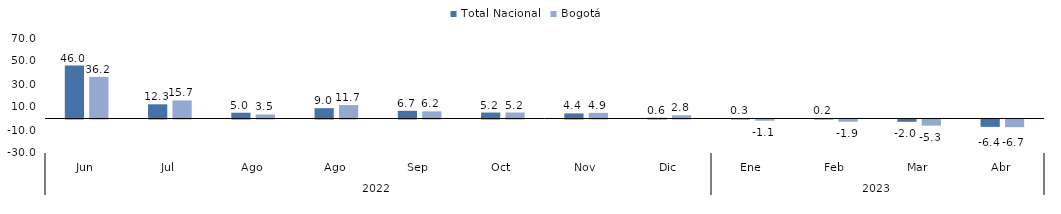
| Category | Total Nacional | Bogotá |
|---|---|---|
| 0 | 45.995 | 36.206 |
| 1 | 12.341 | 15.697 |
| 2 | 5.016 | 3.507 |
| 3 | 8.976 | 11.673 |
| 4 | 6.699 | 6.208 |
| 5 | 5.181 | 5.211 |
| 6 | 4.411 | 4.925 |
| 7 | 0.608 | 2.822 |
| 8 | 0.34 | -1.059 |
| 9 | 0.234 | -1.926 |
| 10 | -2.001 | -5.346 |
| 11 | -6.428 | -6.689 |